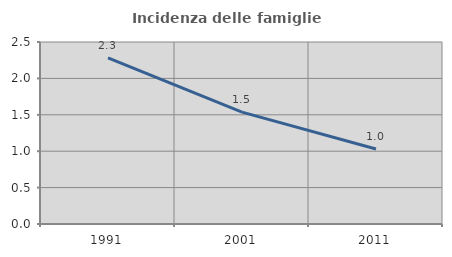
| Category | Incidenza delle famiglie numerose |
|---|---|
| 1991.0 | 2.281 |
| 2001.0 | 1.537 |
| 2011.0 | 1.03 |